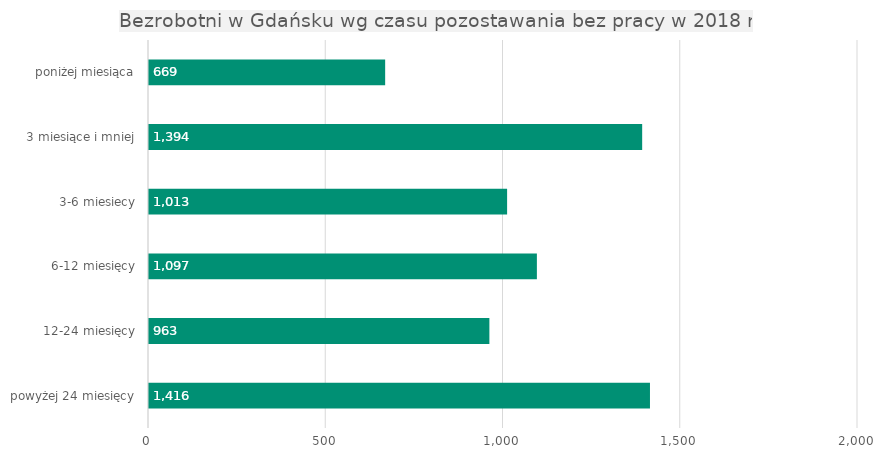
| Category | Series 0 |
|---|---|
| poniżej miesiąca | 669 |
| 3 miesiące i mniej | 1394 |
| 3-6 miesiecy | 1013 |
| 6-12 miesięcy | 1097 |
| 12-24 miesięcy | 963 |
| powyżej 24 miesięcy | 1416 |